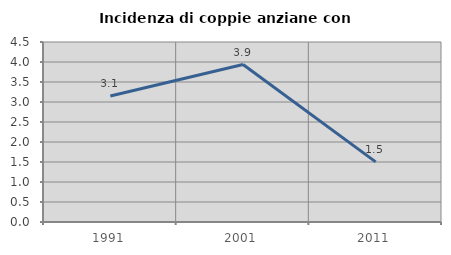
| Category | Incidenza di coppie anziane con figli |
|---|---|
| 1991.0 | 3.15 |
| 2001.0 | 3.937 |
| 2011.0 | 1.504 |